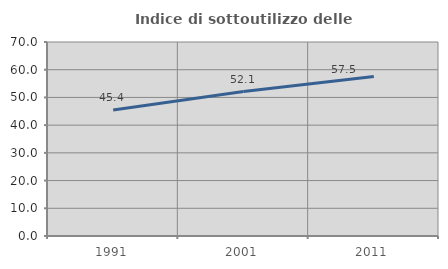
| Category | Indice di sottoutilizzo delle abitazioni  |
|---|---|
| 1991.0 | 45.426 |
| 2001.0 | 52.121 |
| 2011.0 | 57.53 |